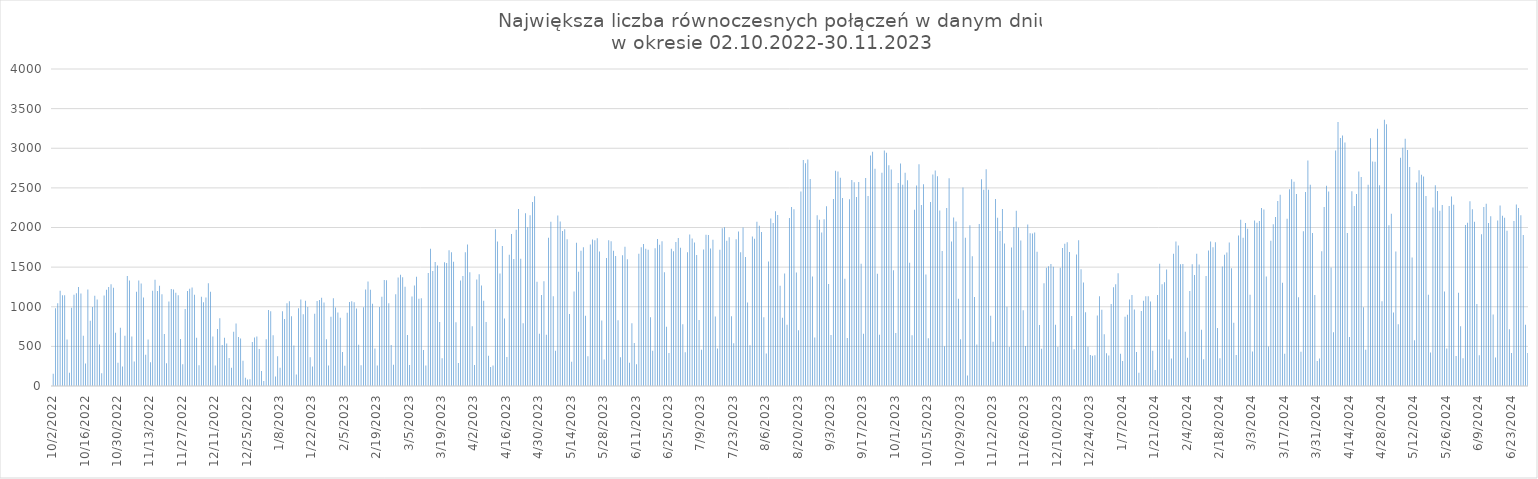
| Category | Max liczba połączeń |
|---|---|
| 10/2/22 | 155 |
| 10/3/22 | 980 |
| 10/4/22 | 1045 |
| 10/5/22 | 1201 |
| 10/6/22 | 1144 |
| 10/7/22 | 1146 |
| 10/8/22 | 586 |
| 10/9/22 | 166 |
| 10/10/22 | 988 |
| 10/11/22 | 1151 |
| 10/12/22 | 1169 |
| 10/13/22 | 1249 |
| 10/14/22 | 1166 |
| 10/15/22 | 634 |
| 10/16/22 | 284 |
| 10/17/22 | 1217 |
| 10/18/22 | 824 |
| 10/19/22 | 998 |
| 10/20/22 | 1138 |
| 10/21/22 | 1093 |
| 10/22/22 | 523 |
| 10/23/22 | 161 |
| 10/24/22 | 1141 |
| 10/25/22 | 1214 |
| 10/26/22 | 1249 |
| 10/27/22 | 1285 |
| 10/28/22 | 1240 |
| 10/29/22 | 672 |
| 10/30/22 | 293 |
| 10/31/22 | 735 |
| 11/1/22 | 247 |
| 11/2/22 | 634 |
| 11/3/22 | 1387 |
| 11/4/22 | 1331 |
| 11/5/22 | 626 |
| 11/6/22 | 309 |
| 11/7/22 | 1189 |
| 11/8/22 | 1330 |
| 11/9/22 | 1292 |
| 11/10/22 | 1117 |
| 11/11/22 | 394 |
| 11/12/22 | 586 |
| 11/13/22 | 301 |
| 11/14/22 | 1201 |
| 11/15/22 | 1342 |
| 11/16/22 | 1199 |
| 11/17/22 | 1266 |
| 11/18/22 | 1157 |
| 11/19/22 | 657 |
| 11/20/22 | 286 |
| 11/21/22 | 1065 |
| 11/22/22 | 1224 |
| 11/23/22 | 1217 |
| 11/24/22 | 1176 |
| 11/25/22 | 1145 |
| 11/26/22 | 593 |
| 11/27/22 | 275 |
| 11/28/22 | 973 |
| 11/29/22 | 1198 |
| 11/30/22 | 1227 |
| 12/1/22 | 1243 |
| 12/2/22 | 1152 |
| 12/3/22 | 610 |
| 12/4/22 | 262 |
| 12/5/22 | 1125 |
| 12/6/22 | 1056 |
| 12/7/22 | 1118 |
| 12/8/22 | 1295 |
| 12/9/22 | 1189 |
| 12/10/22 | 626 |
| 12/11/22 | 260 |
| 12/12/22 | 720 |
| 12/13/22 | 856 |
| 12/14/22 | 516 |
| 12/15/22 | 608 |
| 12/16/22 | 535 |
| 12/17/22 | 354 |
| 12/18/22 | 231 |
| 12/19/22 | 685 |
| 12/20/22 | 790 |
| 12/21/22 | 619 |
| 12/22/22 | 600 |
| 12/23/22 | 318 |
| 12/24/22 | 105 |
| 12/25/22 | 82 |
| 12/26/22 | 84 |
| 12/27/22 | 556 |
| 12/28/22 | 611 |
| 12/29/22 | 624 |
| 12/30/22 | 466 |
| 12/31/22 | 189 |
| 1/1/23 | 64 |
| 1/2/23 | 589 |
| 1/3/23 | 958 |
| 1/4/23 | 943 |
| 1/5/23 | 641 |
| 1/6/23 | 119 |
| 1/7/23 | 374 |
| 1/8/23 | 230 |
| 1/9/23 | 942 |
| 1/10/23 | 845 |
| 1/11/23 | 1043 |
| 1/12/23 | 1068 |
| 1/13/23 | 881 |
| 1/14/23 | 512 |
| 1/15/23 | 144 |
| 1/16/23 | 981 |
| 1/17/23 | 1091 |
| 1/18/23 | 904 |
| 1/19/23 | 1077 |
| 1/20/23 | 998 |
| 1/21/23 | 363 |
| 1/22/23 | 247 |
| 1/23/23 | 913 |
| 1/24/23 | 1072 |
| 1/25/23 | 1084 |
| 1/26/23 | 1112 |
| 1/27/23 | 1054 |
| 1/28/23 | 589 |
| 1/29/23 | 259 |
| 1/30/23 | 874 |
| 1/31/23 | 1108 |
| 2/1/23 | 989 |
| 2/2/23 | 926 |
| 2/3/23 | 862 |
| 2/4/23 | 430 |
| 2/5/23 | 257 |
| 2/6/23 | 925 |
| 2/7/23 | 1059 |
| 2/8/23 | 1070 |
| 2/9/23 | 1057 |
| 2/10/23 | 978 |
| 2/11/23 | 522 |
| 2/12/23 | 262 |
| 2/13/23 | 995 |
| 2/14/23 | 1218 |
| 2/15/23 | 1319 |
| 2/16/23 | 1216 |
| 2/17/23 | 1039 |
| 2/18/23 | 472 |
| 2/19/23 | 259 |
| 2/20/23 | 997 |
| 2/21/23 | 1126 |
| 2/22/23 | 1339 |
| 2/23/23 | 1335 |
| 2/24/23 | 1044 |
| 2/25/23 | 517 |
| 2/26/23 | 268 |
| 2/27/23 | 1157 |
| 2/28/23 | 1368 |
| 3/1/23 | 1405 |
| 3/2/23 | 1371 |
| 3/3/23 | 1253 |
| 3/4/23 | 642 |
| 3/5/23 | 266 |
| 3/6/23 | 1129 |
| 3/7/23 | 1268 |
| 3/8/23 | 1378 |
| 3/9/23 | 1101 |
| 3/10/23 | 1108 |
| 3/11/23 | 454 |
| 3/12/23 | 260 |
| 3/13/23 | 1425 |
| 3/14/23 | 1733 |
| 3/15/23 | 1450 |
| 3/16/23 | 1564 |
| 3/17/23 | 1519 |
| 3/18/23 | 809 |
| 3/19/23 | 351 |
| 3/20/23 | 1561 |
| 3/21/23 | 1552 |
| 3/22/23 | 1714 |
| 3/23/23 | 1688 |
| 3/24/23 | 1567 |
| 3/25/23 | 805 |
| 3/26/23 | 290 |
| 3/27/23 | 1330 |
| 3/28/23 | 1387 |
| 3/29/23 | 1688 |
| 3/30/23 | 1785 |
| 3/31/23 | 1435 |
| 4/1/23 | 753 |
| 4/2/23 | 266 |
| 4/3/23 | 1345 |
| 4/4/23 | 1411 |
| 4/5/23 | 1267 |
| 4/6/23 | 1076 |
| 4/7/23 | 809 |
| 4/8/23 | 383 |
| 4/9/23 | 240 |
| 4/10/23 | 259 |
| 4/11/23 | 1977 |
| 4/12/23 | 1824 |
| 4/13/23 | 1418 |
| 4/14/23 | 1765 |
| 4/15/23 | 853 |
| 4/16/23 | 366 |
| 4/17/23 | 1657 |
| 4/18/23 | 1919 |
| 4/19/23 | 1601 |
| 4/20/23 | 1972 |
| 4/21/23 | 2235 |
| 4/22/23 | 1607 |
| 4/23/23 | 792 |
| 4/24/23 | 2181 |
| 4/25/23 | 2004 |
| 4/26/23 | 2153 |
| 4/27/23 | 2323 |
| 4/28/23 | 2394 |
| 4/29/23 | 1315 |
| 4/30/23 | 658 |
| 5/1/23 | 1148 |
| 5/2/23 | 1322 |
| 5/3/23 | 646 |
| 5/4/23 | 1870 |
| 5/5/23 | 2072 |
| 5/6/23 | 1132 |
| 5/7/23 | 445 |
| 5/8/23 | 2150 |
| 5/9/23 | 2075 |
| 5/10/23 | 1957 |
| 5/11/23 | 1979 |
| 5/12/23 | 1851 |
| 5/13/23 | 910 |
| 5/14/23 | 307 |
| 5/15/23 | 1192 |
| 5/16/23 | 1808 |
| 5/17/23 | 1443 |
| 5/18/23 | 1708 |
| 5/19/23 | 1751 |
| 5/20/23 | 888 |
| 5/21/23 | 376 |
| 5/22/23 | 1786 |
| 5/23/23 | 1850 |
| 5/24/23 | 1839 |
| 5/25/23 | 1864 |
| 5/26/23 | 1698 |
| 5/27/23 | 825 |
| 5/28/23 | 333 |
| 5/29/23 | 1616 |
| 5/30/23 | 1838 |
| 5/31/23 | 1828 |
| 6/1/23 | 1708 |
| 6/2/23 | 1640 |
| 6/3/23 | 829 |
| 6/4/23 | 363 |
| 6/5/23 | 1651 |
| 6/6/23 | 1756 |
| 6/7/23 | 1600 |
| 6/8/23 | 293 |
| 6/9/23 | 793 |
| 6/10/23 | 544 |
| 6/11/23 | 274 |
| 6/12/23 | 1669 |
| 6/13/23 | 1752 |
| 6/14/23 | 1793 |
| 6/15/23 | 1733 |
| 6/16/23 | 1719 |
| 6/17/23 | 867 |
| 6/18/23 | 446 |
| 6/19/23 | 1738 |
| 6/20/23 | 1856 |
| 6/21/23 | 1781 |
| 6/22/23 | 1826 |
| 6/23/23 | 1435 |
| 6/24/23 | 749 |
| 6/25/23 | 415 |
| 6/26/23 | 1732 |
| 6/27/23 | 1701 |
| 6/28/23 | 1818 |
| 6/29/23 | 1869 |
| 6/30/23 | 1743 |
| 7/1/23 | 778 |
| 7/2/23 | 426 |
| 7/3/23 | 1687 |
| 7/4/23 | 1912 |
| 7/5/23 | 1861 |
| 7/6/23 | 1810 |
| 7/7/23 | 1654 |
| 7/8/23 | 832 |
| 7/9/23 | 458 |
| 7/10/23 | 1721 |
| 7/11/23 | 1910 |
| 7/12/23 | 1905 |
| 7/13/23 | 1735 |
| 7/14/23 | 1846 |
| 7/15/23 | 877 |
| 7/16/23 | 474 |
| 7/17/23 | 1720 |
| 7/18/23 | 1992 |
| 7/19/23 | 2003 |
| 7/20/23 | 1834 |
| 7/21/23 | 1878 |
| 7/22/23 | 881 |
| 7/23/23 | 540 |
| 7/24/23 | 1853 |
| 7/25/23 | 1948 |
| 7/26/23 | 1688 |
| 7/27/23 | 2000 |
| 7/28/23 | 1629 |
| 7/29/23 | 1055 |
| 7/30/23 | 513 |
| 7/31/23 | 1887 |
| 8/1/23 | 1859 |
| 8/2/23 | 2071 |
| 8/3/23 | 2021 |
| 8/4/23 | 1944 |
| 8/5/23 | 869 |
| 8/6/23 | 410 |
| 8/7/23 | 1570 |
| 8/8/23 | 2114 |
| 8/9/23 | 2057 |
| 8/10/23 | 2205 |
| 8/11/23 | 2158 |
| 8/12/23 | 1266 |
| 8/13/23 | 860 |
| 8/14/23 | 1418 |
| 8/15/23 | 774 |
| 8/16/23 | 2120 |
| 8/17/23 | 2260 |
| 8/18/23 | 2230 |
| 8/19/23 | 1431 |
| 8/20/23 | 704 |
| 8/21/23 | 2453 |
| 8/22/23 | 2852 |
| 8/23/23 | 2811 |
| 8/24/23 | 2858 |
| 8/25/23 | 2613 |
| 8/26/23 | 1383 |
| 8/27/23 | 611 |
| 8/28/23 | 2153 |
| 8/29/23 | 2099 |
| 8/30/23 | 1938 |
| 8/31/23 | 2104 |
| 9/1/23 | 2267 |
| 9/2/23 | 1288 |
| 9/3/23 | 642 |
| 9/4/23 | 2361 |
| 9/5/23 | 2715 |
| 9/6/23 | 2706 |
| 9/7/23 | 2629 |
| 9/8/23 | 2373 |
| 9/9/23 | 1354 |
| 9/10/23 | 605 |
| 9/11/23 | 2355 |
| 9/12/23 | 2598 |
| 9/13/23 | 2572 |
| 9/14/23 | 2384 |
| 9/15/23 | 2575 |
| 9/16/23 | 1542 |
| 9/17/23 | 660 |
| 9/18/23 | 2625 |
| 9/19/23 | 2399 |
| 9/20/23 | 2908 |
| 9/21/23 | 2956 |
| 9/22/23 | 2741 |
| 9/23/23 | 1416 |
| 9/24/23 | 647 |
| 9/25/23 | 2690 |
| 9/26/23 | 2973 |
| 9/27/23 | 2942 |
| 9/28/23 | 2784 |
| 9/29/23 | 2733 |
| 9/30/23 | 1462 |
| 10/1/23 | 670 |
| 10/2/23 | 2562 |
| 10/3/23 | 2808 |
| 10/4/23 | 2541 |
| 10/5/23 | 2690 |
| 10/6/23 | 2596 |
| 10/7/23 | 1554 |
| 10/8/23 | 640 |
| 10/9/23 | 2225 |
| 10/10/23 | 2531 |
| 10/11/23 | 2799 |
| 10/12/23 | 2283 |
| 10/13/23 | 2546 |
| 10/14/23 | 1406 |
| 10/15/23 | 604 |
| 10/16/23 | 2322 |
| 10/17/23 | 2670 |
| 10/18/23 | 2718 |
| 10/19/23 | 2646 |
| 10/20/23 | 2215 |
| 10/21/23 | 1702 |
| 10/22/23 | 501 |
| 10/23/23 | 2246 |
| 10/24/23 | 2620 |
| 10/25/23 | 1822 |
| 10/26/23 | 2125 |
| 10/27/23 | 2076 |
| 10/28/23 | 1100 |
| 10/29/23 | 591 |
| 10/30/23 | 2506 |
| 10/31/23 | 1870 |
| 11/1/23 | 132 |
| 11/2/23 | 2029 |
| 11/3/23 | 1636 |
| 11/4/23 | 1123 |
| 11/5/23 | 523 |
| 11/6/23 | 2045 |
| 11/7/23 | 2610 |
| 11/8/23 | 2476 |
| 11/9/23 | 2734 |
| 11/10/23 | 2477 |
| 11/11/23 | 887 |
| 11/12/23 | 558 |
| 11/13/23 | 2361 |
| 11/14/23 | 2123 |
| 11/15/23 | 1956 |
| 11/16/23 | 2233 |
| 11/17/23 | 1799 |
| 11/18/23 | 1001 |
| 11/19/23 | 492 |
| 11/20/23 | 1747 |
| 11/21/23 | 2006 |
| 11/22/23 | 2210 |
| 11/23/23 | 1999 |
| 11/24/23 | 1837 |
| 11/25/23 | 956 |
| 11/26/23 | 506 |
| 11/27/23 | 2038 |
| 11/28/23 | 1927 |
| 11/29/23 | 1924 |
| 11/30/23 | 1936 |
| 12/1/23 | 1694 |
| 12/2/23 | 769 |
| 12/3/23 | 469 |
| 12/4/23 | 1297 |
| 12/5/23 | 1491 |
| 12/6/23 | 1512 |
| 12/7/23 | 1540 |
| 12/8/23 | 1504 |
| 12/9/23 | 772 |
| 12/10/23 | 493 |
| 12/11/23 | 1491 |
| 12/12/23 | 1741 |
| 12/13/23 | 1795 |
| 12/14/23 | 1814 |
| 12/15/23 | 1690 |
| 12/16/23 | 882 |
| 12/17/23 | 463 |
| 12/18/23 | 1660 |
| 12/19/23 | 1839 |
| 12/20/23 | 1472 |
| 12/21/23 | 1306 |
| 12/22/23 | 930 |
| 12/23/23 | 495 |
| 12/24/23 | 391 |
| 12/25/23 | 382 |
| 12/26/23 | 389 |
| 12/27/23 | 890 |
| 12/28/23 | 1134 |
| 12/29/23 | 962 |
| 12/30/23 | 653 |
| 12/31/23 | 413 |
| 1/1/24 | 386 |
| 1/2/24 | 1034 |
| 1/3/24 | 1246 |
| 1/4/24 | 1283 |
| 1/5/24 | 1422 |
| 1/6/24 | 406 |
| 1/7/24 | 314 |
| 1/8/24 | 873 |
| 1/9/24 | 898 |
| 1/10/24 | 1093 |
| 1/11/24 | 1148 |
| 1/12/24 | 964 |
| 1/13/24 | 430 |
| 1/14/24 | 167 |
| 1/15/24 | 947 |
| 1/16/24 | 1076 |
| 1/17/24 | 1134 |
| 1/18/24 | 1133 |
| 1/19/24 | 1067 |
| 1/20/24 | 446 |
| 1/21/24 | 203 |
| 1/22/24 | 1148 |
| 1/23/24 | 1544 |
| 1/24/24 | 1284 |
| 1/25/24 | 1308 |
| 1/26/24 | 1469 |
| 1/27/24 | 587 |
| 1/28/24 | 348 |
| 1/29/24 | 1668 |
| 1/30/24 | 1824 |
| 1/31/24 | 1773 |
| 2/1/24 | 1537 |
| 2/2/24 | 1541 |
| 2/3/24 | 685 |
| 2/4/24 | 358 |
| 2/5/24 | 1198 |
| 2/6/24 | 1535 |
| 2/7/24 | 1401 |
| 2/8/24 | 1668 |
| 2/9/24 | 1533 |
| 2/10/24 | 709 |
| 2/11/24 | 338 |
| 2/12/24 | 1389 |
| 2/13/24 | 1710 |
| 2/14/24 | 1824 |
| 2/15/24 | 1751 |
| 2/16/24 | 1813 |
| 2/17/24 | 732 |
| 2/18/24 | 349 |
| 2/19/24 | 1509 |
| 2/20/24 | 1657 |
| 2/21/24 | 1685 |
| 2/22/24 | 1812 |
| 2/23/24 | 1486 |
| 2/24/24 | 798 |
| 2/25/24 | 392 |
| 2/26/24 | 1899 |
| 2/27/24 | 2097 |
| 2/28/24 | 1872 |
| 2/29/24 | 2058 |
| 3/1/24 | 1985 |
| 3/2/24 | 1152 |
| 3/3/24 | 434 |
| 3/4/24 | 2088 |
| 3/5/24 | 2059 |
| 3/6/24 | 2082 |
| 3/7/24 | 2246 |
| 3/8/24 | 2227 |
| 3/9/24 | 1381 |
| 3/10/24 | 497 |
| 3/11/24 | 1833 |
| 3/12/24 | 2042 |
| 3/13/24 | 2133 |
| 3/14/24 | 2335 |
| 3/15/24 | 2412 |
| 3/16/24 | 1303 |
| 3/17/24 | 408 |
| 3/18/24 | 2111 |
| 3/19/24 | 2483 |
| 3/20/24 | 2609 |
| 3/21/24 | 2576 |
| 3/22/24 | 2424 |
| 3/23/24 | 1119 |
| 3/24/24 | 432 |
| 3/25/24 | 1952 |
| 3/26/24 | 2449 |
| 3/27/24 | 2845 |
| 3/28/24 | 2538 |
| 3/29/24 | 1930 |
| 3/30/24 | 1149 |
| 3/31/24 | 316 |
| 4/1/24 | 348 |
| 4/2/24 | 1700 |
| 4/3/24 | 2258 |
| 4/4/24 | 2528 |
| 4/5/24 | 2455 |
| 4/6/24 | 1494 |
| 4/7/24 | 677 |
| 4/8/24 | 2973 |
| 4/9/24 | 3332 |
| 4/10/24 | 3128 |
| 4/11/24 | 3162 |
| 4/12/24 | 3072 |
| 4/13/24 | 1931 |
| 4/14/24 | 618 |
| 4/15/24 | 2458 |
| 4/16/24 | 2272 |
| 4/17/24 | 2423 |
| 4/18/24 | 2707 |
| 4/19/24 | 2636 |
| 4/20/24 | 995 |
| 4/21/24 | 457 |
| 4/22/24 | 2541 |
| 4/23/24 | 3125 |
| 4/24/24 | 2834 |
| 4/25/24 | 2829 |
| 4/26/24 | 3245 |
| 4/27/24 | 2534 |
| 4/28/24 | 1070 |
| 4/29/24 | 3360 |
| 4/30/24 | 3302 |
| 5/1/24 | 2027 |
| 5/2/24 | 2175 |
| 5/3/24 | 926 |
| 5/4/24 | 1697 |
| 5/5/24 | 778 |
| 5/6/24 | 2880 |
| 5/7/24 | 3006 |
| 5/8/24 | 3121 |
| 5/9/24 | 2977 |
| 5/10/24 | 2764 |
| 5/11/24 | 1620 |
| 5/12/24 | 577 |
| 5/13/24 | 2568 |
| 5/14/24 | 2723 |
| 5/15/24 | 2666 |
| 5/16/24 | 2645 |
| 5/17/24 | 2399 |
| 5/18/24 | 1152 |
| 5/19/24 | 422 |
| 5/20/24 | 2251 |
| 5/21/24 | 2534 |
| 5/22/24 | 2462 |
| 5/23/24 | 2212 |
| 5/24/24 | 2283 |
| 5/25/24 | 1194 |
| 5/26/24 | 473 |
| 5/27/24 | 2272 |
| 5/28/24 | 2392 |
| 5/29/24 | 2288 |
| 5/30/24 | 380 |
| 5/31/24 | 1176 |
| 6/1/24 | 753 |
| 6/2/24 | 350 |
| 6/3/24 | 2031 |
| 6/4/24 | 2059 |
| 6/5/24 | 2332 |
| 6/6/24 | 2229 |
| 6/7/24 | 2071 |
| 6/8/24 | 1036 |
| 6/9/24 | 387 |
| 6/10/24 | 1915 |
| 6/11/24 | 2260 |
| 6/12/24 | 2299 |
| 6/13/24 | 2057 |
| 6/14/24 | 2142 |
| 6/15/24 | 901 |
| 6/16/24 | 359 |
| 6/17/24 | 2089 |
| 6/18/24 | 2279 |
| 6/19/24 | 2147 |
| 6/20/24 | 2122 |
| 6/21/24 | 1960 |
| 6/22/24 | 715 |
| 6/23/24 | 415 |
| 6/24/24 | 2082 |
| 6/25/24 | 2290 |
| 6/26/24 | 2246 |
| 6/27/24 | 2155 |
| 6/28/24 | 1906 |
| 6/29/24 | 774 |
| 6/30/24 | 415 |